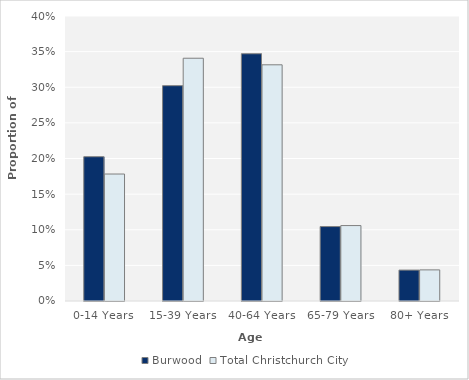
| Category | Burwood | Total Christchurch City |
|---|---|---|
| 0-14 Years | 0.203 | 0.178 |
| 15-39 Years | 0.302 | 0.341 |
| 40-64 Years | 0.347 | 0.331 |
| 65-79 Years | 0.104 | 0.106 |
| 80+ Years | 0.043 | 0.044 |